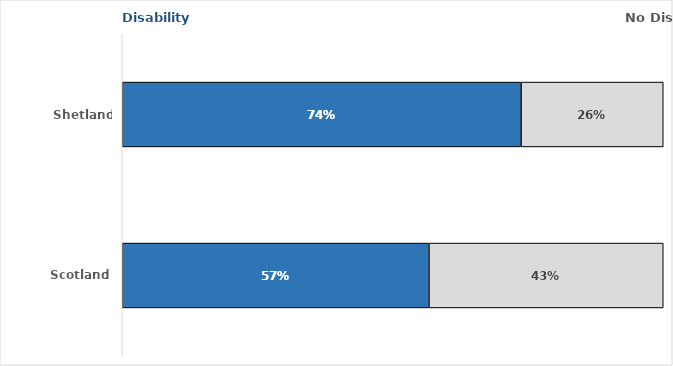
| Category | Disability | No Disability |
|---|---|---|
| Shetland Islands | 0.737 | 0.263 |
| Scotland | 0.567 | 0.433 |